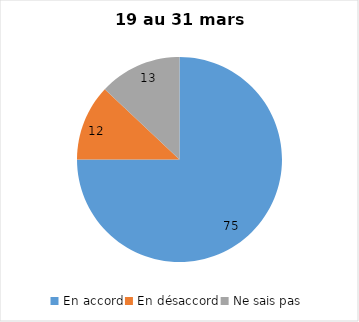
| Category | Series 0 |
|---|---|
| En accord | 75 |
| En désaccord | 12 |
| Ne sais pas | 13 |